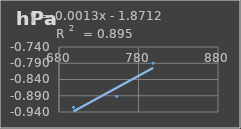
| Category | Presión Atmosférica |
|---|---|
| 698.3 | -0.926 |
| 752.6 | -0.892 |
| 798.4 | -0.79 |